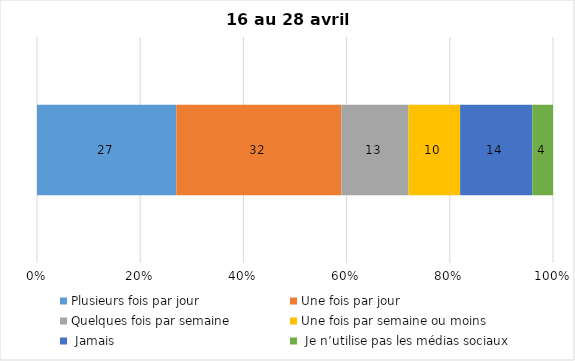
| Category | Plusieurs fois par jour | Une fois par jour | Quelques fois par semaine   | Une fois par semaine ou moins   |  Jamais   |  Je n’utilise pas les médias sociaux |
|---|---|---|---|---|---|---|
| 0 | 27 | 32 | 13 | 10 | 14 | 4 |